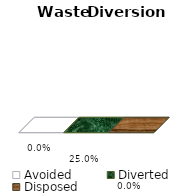
| Category | Avoided | Diverted | Disposed |
|---|---|---|---|
| 0 | 0 | 0 | 0 |